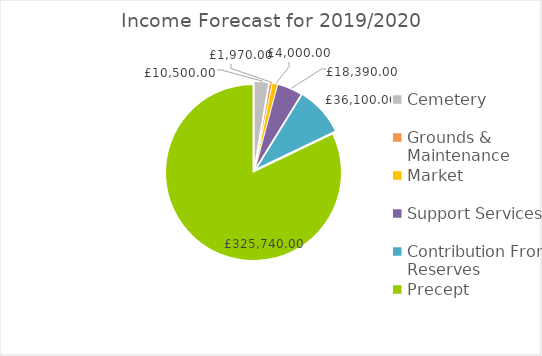
| Category | Series 0 |
|---|---|
| Cemetery | 10500 |
| Grounds & Maintenance | 1970 |
| Market   | 4000 |
| Support Services | 18390 |
| Contribution From Reserves | 36100 |
| Precept | 325740 |